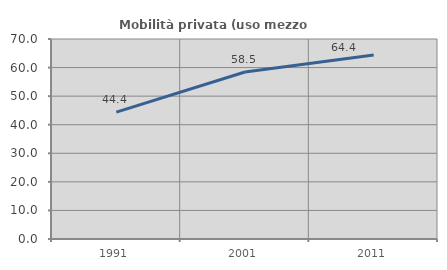
| Category | Mobilità privata (uso mezzo privato) |
|---|---|
| 1991.0 | 44.414 |
| 2001.0 | 58.466 |
| 2011.0 | 64.434 |